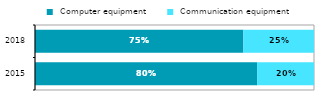
| Category |  Computer equipment |  Communication equipment |
|---|---|---|
| 2015 | 0.796 | 0.204 |
| 2018 | 0.747 | 0.253 |